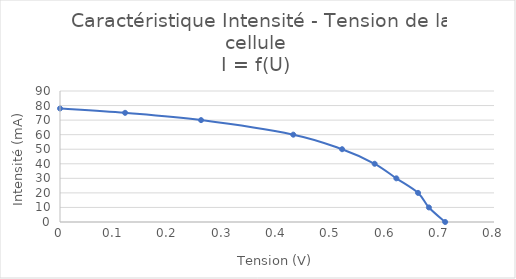
| Category | Series 0 |
|---|---|
| 0.71 | 0 |
| 0.68 | 10 |
| 0.66 | 20 |
| 0.62 | 30 |
| 0.58 | 40 |
| 0.52 | 50 |
| 0.43 | 60 |
| 0.26 | 70 |
| 0.12 | 75 |
| 0.0 | 78 |